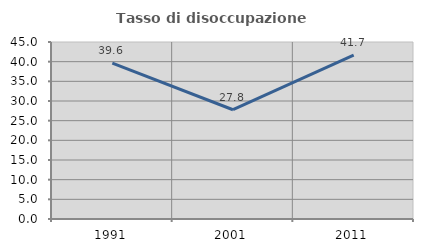
| Category | Tasso di disoccupazione giovanile  |
|---|---|
| 1991.0 | 39.64 |
| 2001.0 | 27.778 |
| 2011.0 | 41.667 |